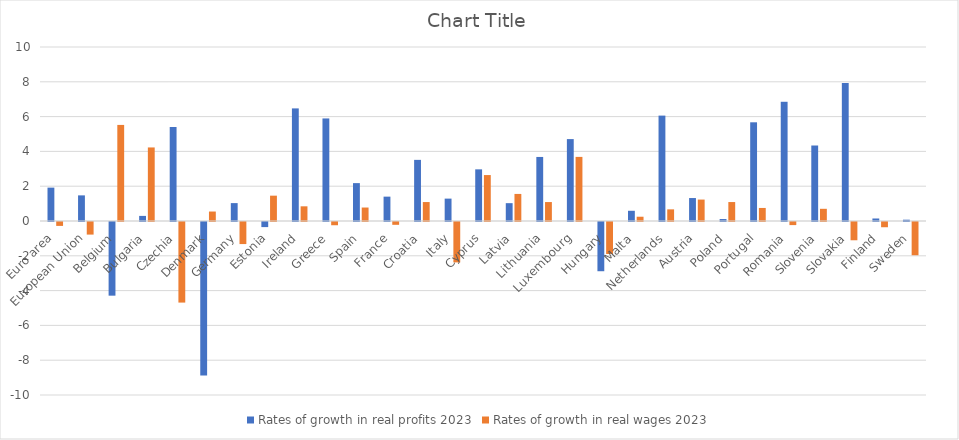
| Category | Rates of growth in real profits 2023 | Rates of growth in real wages 2023 |
|---|---|---|
| Euro area | 1.918 | -0.224 |
| European Union | 1.473 | -0.724 |
| Belgium | -4.234 | 5.522 |
| Bulgaria | 0.293 | 4.227 |
| Czechia | 5.403 | -4.631 |
| Denmark | -8.822 | 0.544 |
| Germany | 1.029 | -1.268 |
| Estonia | -0.293 | 1.456 |
| Ireland | 6.471 | 0.844 |
| Greece | 5.894 | -0.186 |
| Spain | 2.177 | 0.774 |
| France | 1.4 | -0.162 |
| Croatia | 3.513 | 1.089 |
| Italy | 1.286 | -2.322 |
| Cyprus | 2.968 | 2.64 |
| Latvia | 1.025 | 1.556 |
| Lithuania | 3.681 | 1.089 |
| Luxembourg | 4.707 | 3.684 |
| Hungary | -2.829 | -1.84 |
| Malta | 0.587 | 0.246 |
| Netherlands | 6.057 | 0.67 |
| Austria | 1.319 | 1.232 |
| Poland | 0.113 | 1.089 |
| Portugal | 5.672 | 0.75 |
| Romania | 6.852 | -0.178 |
| Slovenia | 4.339 | 0.701 |
| Slovakia | 7.927 | -1.05 |
| Finland | 0.144 | -0.301 |
| Sweden | 0.075 | -1.91 |